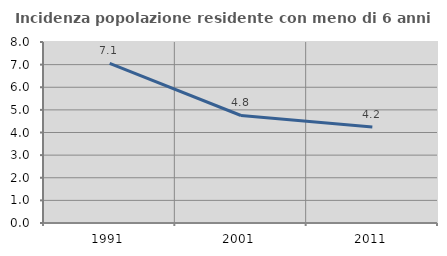
| Category | Incidenza popolazione residente con meno di 6 anni |
|---|---|
| 1991.0 | 7.058 |
| 2001.0 | 4.752 |
| 2011.0 | 4.242 |